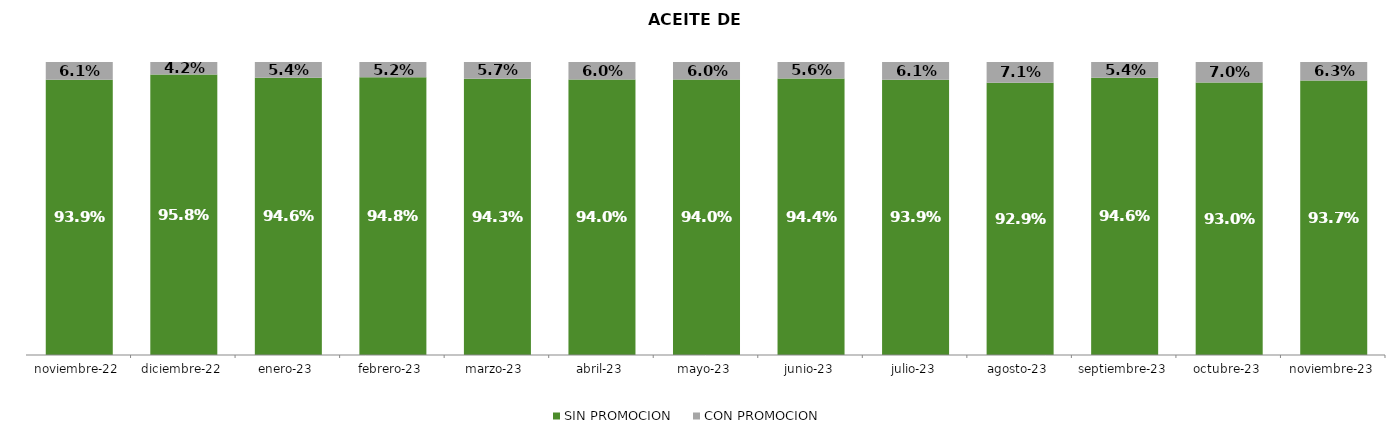
| Category | SIN PROMOCION   | CON PROMOCION   |
|---|---|---|
| 2022-11-01 | 0.939 | 0.061 |
| 2022-12-01 | 0.958 | 0.042 |
| 2023-01-01 | 0.946 | 0.054 |
| 2023-02-01 | 0.948 | 0.052 |
| 2023-03-01 | 0.943 | 0.057 |
| 2023-04-01 | 0.94 | 0.06 |
| 2023-05-01 | 0.94 | 0.06 |
| 2023-06-01 | 0.944 | 0.056 |
| 2023-07-01 | 0.939 | 0.061 |
| 2023-08-01 | 0.929 | 0.071 |
| 2023-09-01 | 0.946 | 0.054 |
| 2023-10-01 | 0.93 | 0.07 |
| 2023-11-01 | 0.937 | 0.063 |